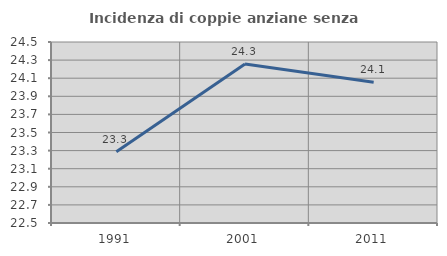
| Category | Incidenza di coppie anziane senza figli  |
|---|---|
| 1991.0 | 23.288 |
| 2001.0 | 24.256 |
| 2011.0 | 24.054 |